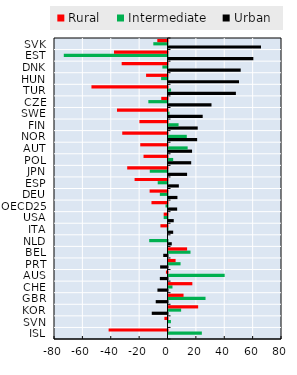
| Category | Urban | Intermediate | Rural |
|---|---|---|---|
| ISL | 0 | 23.5 | -41.5 |
| SVN | 0 | 1.7 | -2.2 |
| KOR | -11.1 | 8.9 | 20.9 |
| GBR | -8.3 | 26.1 | 10.6 |
| CHE | -7.1 | 2.8 | 16.8 |
| AUS | -5.4 | 39.6 | -1.1 |
| PRT | -5.2 | 8.5 | 5 |
| BEL | -3 | 15.5 | 13.1 |
| NLD | 2.3 | -12.9 | 0 |
| ITA | 3.3 | -0.5 | -5 |
| USA | 3.7 | -2.7 | -2.7 |
| OECD25 | 6.1 | -1.4 | -11.3 |
| DEU | 6.3 | -5.4 | -12.6 |
| ESP | 7.3 | -6.9 | -23.2 |
| JPN | 13.1 | -12.5 | -28.4 |
| POL | 16 | 3.3 | -16.9 |
| AUT | 16.6 | 13.5 | -19.2 |
| NOR | 20.2 | 12.9 | -31.9 |
| FIN | 20.6 | 7.1 | -19.8 |
| SWE | 24.1 | 0.7 | -35.6 |
| CZE | 30.3 | -13.5 | -4.4 |
| TUR | 47.5 | 1.8 | -53.6 |
| HUN | 49.7 | -4.5 | -15.1 |
| DNK | 50.9 | -3.6 | -32.3 |
| EST | 59.8 | -73.1 | -37.7 |
| SVK | 65.2 | -10 | -7.2 |